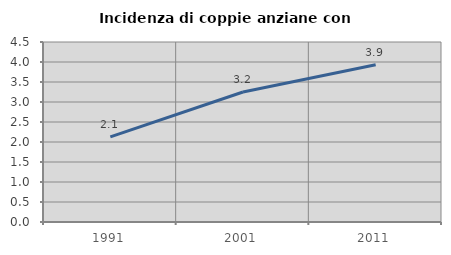
| Category | Incidenza di coppie anziane con figli |
|---|---|
| 1991.0 | 2.128 |
| 2001.0 | 3.249 |
| 2011.0 | 3.93 |